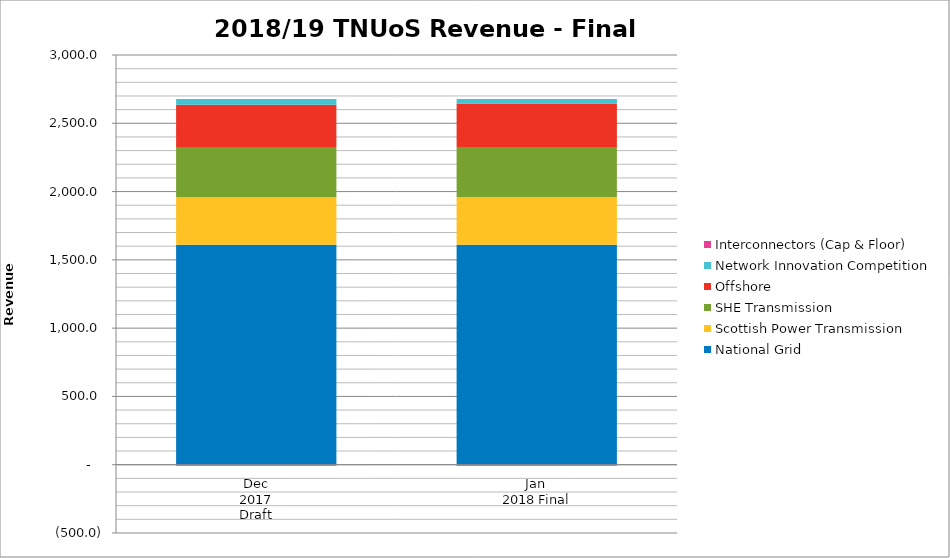
| Category | National Grid | Scottish Power Transmission | SHE Transmission | Offshore | Network Innovation Competition | Interconnectors (Cap & Floor) |
|---|---|---|---|---|---|---|
| Dec
2017
Draft | 1610.655 | 347.003 | 363.045 | 315.794 | 40.5 | -6.8 |
| Jan 
2018 Final | 1609.916 | 349.961 | 366.411 | 318.144 | 32.664 | -6.8 |